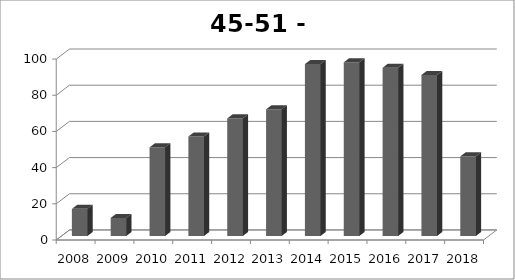
| Category | Haaren |
|---|---|
| 2008.0 | 15 |
| 2009.0 | 10 |
| 2010.0 | 49 |
| 2011.0 | 55 |
| 2012.0 | 65 |
| 2013.0 | 70 |
| 2014.0 | 95 |
| 2015.0 | 96 |
| 2016.0 | 93 |
| 2017.0 | 89 |
| 2018.0 | 44 |